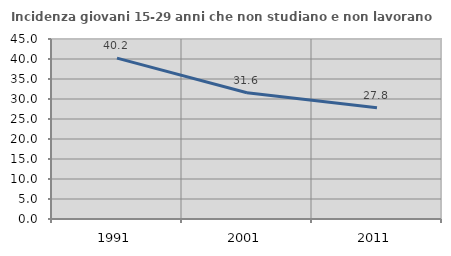
| Category | Incidenza giovani 15-29 anni che non studiano e non lavorano  |
|---|---|
| 1991.0 | 40.229 |
| 2001.0 | 31.579 |
| 2011.0 | 27.803 |